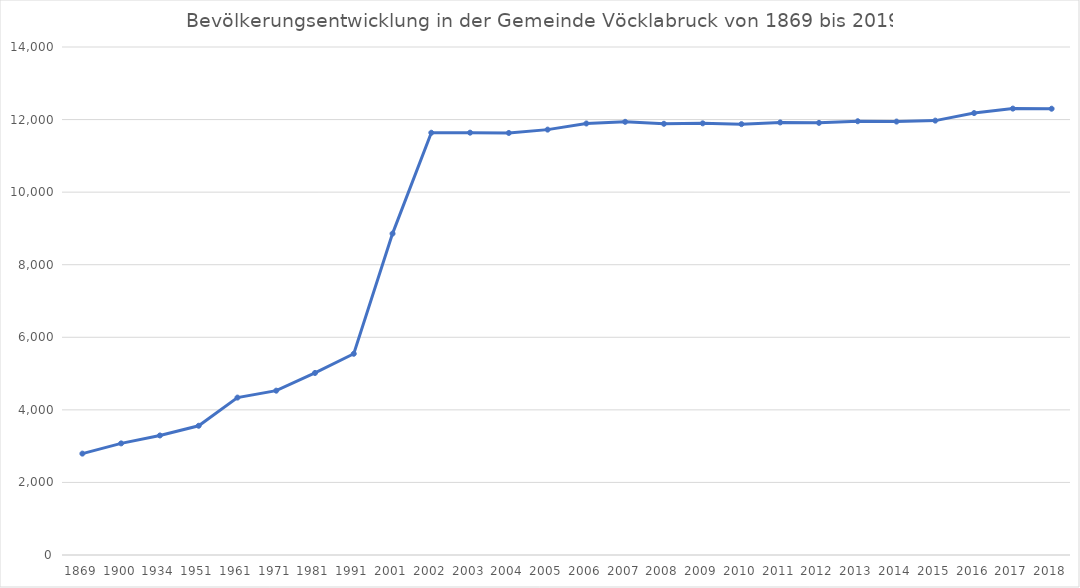
| Category | Einwohner |
|---|---|
| 1869.0 | 2794 |
| 1900.0 | 3076 |
| 1934.0 | 3294 |
| 1951.0 | 3562 |
| 1961.0 | 4338 |
| 1971.0 | 4529 |
| 1981.0 | 5017 |
| 1991.0 | 5546 |
| 2001.0 | 8857 |
| 2002.0 | 11637 |
| 2003.0 | 11639 |
| 2004.0 | 11631 |
| 2005.0 | 11723 |
| 2006.0 | 11892 |
| 2007.0 | 11938 |
| 2008.0 | 11884 |
| 2009.0 | 11896 |
| 2010.0 | 11874 |
| 2011.0 | 11921 |
| 2012.0 | 11909 |
| 2013.0 | 11954 |
| 2014.0 | 11945 |
| 2015.0 | 11971 |
| 2016.0 | 12179 |
| 2017.0 | 12302 |
| 2018.0 | 12299 |